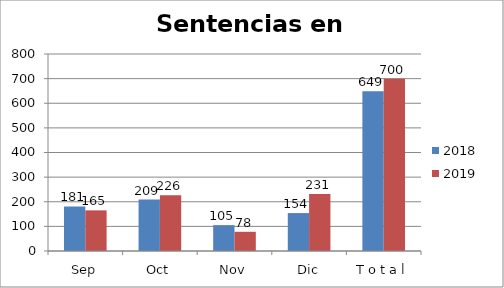
| Category | 2018 | 2019 |
|---|---|---|
| Sep | 181 | 165 |
| Oct | 209 | 226 |
| Nov | 105 | 78 |
| Dic | 154 | 231 |
| T o t a l | 649 | 700 |